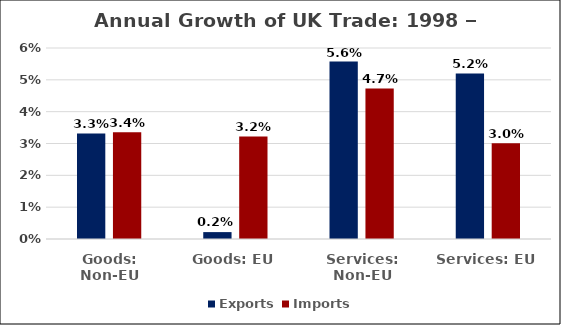
| Category | Exports | Imports |
|---|---|---|
| Goods: Non-EU | 0.033 | 0.034 |
| Goods: EU | 0.002 | 0.032 |
| Services: Non-EU | 0.056 | 0.047 |
| Services: EU | 0.052 | 0.03 |